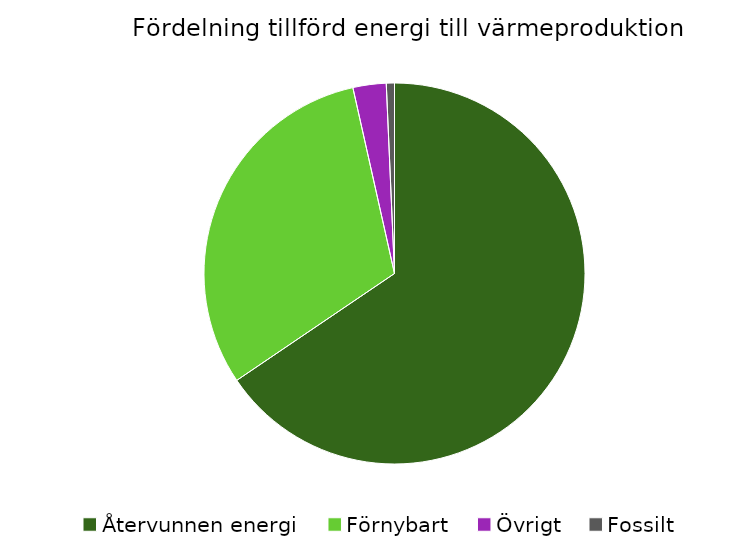
| Category | Fördelning värmeproduktion |
|---|---|
| Återvunnen energi | 0.655 |
| Förnybart | 0.31 |
| Övrigt | 0.028 |
| Fossilt | 0.007 |